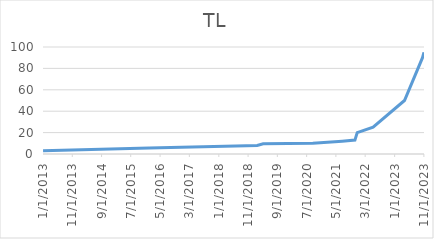
| Category | TL |
|---|---|
| 1/1/13 | 3 |
| 1/7/16 | 5.5 |
| 2/3/19 | 8 |
| 4/6/19 | 9.5 |
| 9/3/20 | 10 |
| 7/5/21 | 12 |
| 11/14/21 | 13 |
| 12/8/21 | 20 |
| 5/22/22 | 25 |
| 4/13/23 | 50 |
| 10/17/23 | 90 |
| 11/1/23 | 95 |